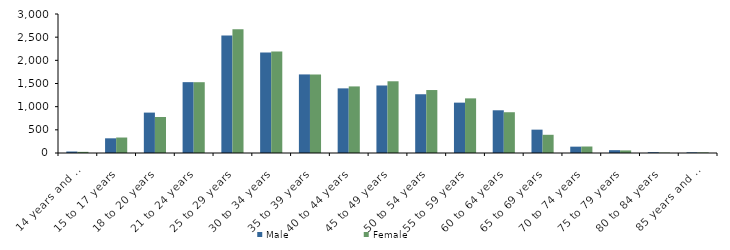
| Category | Male | Female |
|---|---|---|
| 14 years and under | 32 | 25 |
| 15 to 17 years | 317 | 334 |
| 18 to 20 years | 872 | 777 |
| 21 to 24 years | 1529 | 1528 |
| 25 to 29 years | 2536 | 2672 |
| 30 to 34 years | 2170 | 2190 |
| 35 to 39 years | 1696 | 1696 |
| 40 to 44 years | 1395 | 1437 |
| 45 to 49 years | 1457 | 1548 |
| 50 to 54 years | 1268 | 1359 |
| 55 to 59 years | 1087 | 1179 |
| 60 to 64 years | 922 | 880 |
| 65 to 69 years | 504 | 393 |
| 70 to 74 years | 137 | 140 |
| 75 to 79 years | 61 | 56 |
| 80 to 84 years | 18 | 9 |
| 85 years and over | 15 | 13 |